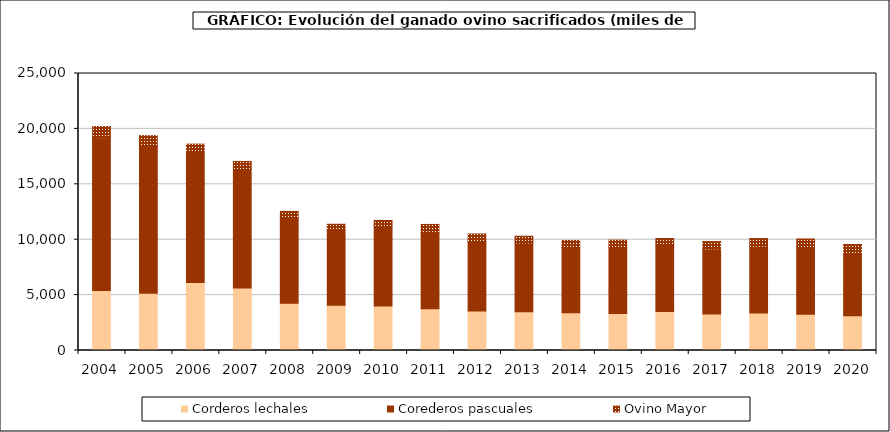
| Category | Corderos lechales | Corederos pascuales | Ovino Mayor |
|---|---|---|---|
| 2004.0 | 5404.652 | 13795.131 | 1014.334 |
| 2005.0 | 5162.599 | 13334.056 | 894.122 |
| 2006.0 | 6135.816 | 11899.5 | 588.049 |
| 2007.0 | 5636.95 | 10753.897 | 671.584 |
| 2008.0 | 4274.009 | 7680.583 | 601.312 |
| 2009.0 | 4077.718 | 6912.598 | 401.948 |
| 2010.0 | 4025.011 | 7225.191 | 485.795 |
| 2011.0 | 3766.943 | 6823.433 | 786.919 |
| 2012.0 | 3554.891 | 6323.737 | 640.04 |
| 2013.0 | 3505.325 | 6199.853 | 606.859 |
| 2014.0 | 3401.013 | 5885.403 | 641.775 |
| 2015.0 | 3343.808 | 6007.202 | 609.166 |
| 2016.0 | 3523.522 | 5979.25 | 609.555 |
| 2017.0 | 3300.962 | 5860.838 | 671.326 |
| 2018.0 | 3387.073 | 6019.548 | 699.086 |
| 2019.0 | 3280.557 | 6058.916 | 720.572 |
| 2020.0 | 3146.831 | 5648.74 | 768.108 |